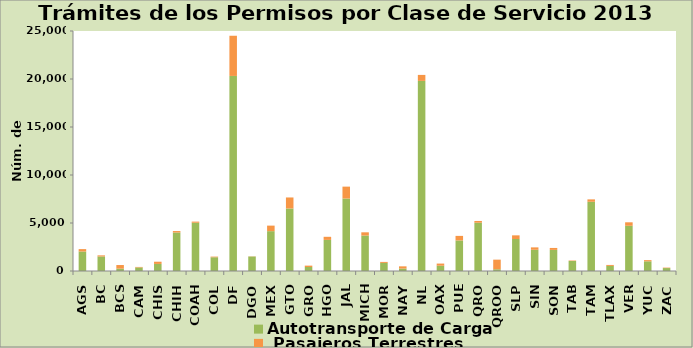
| Category | Autotransporte de Carga  |  Pasajeros Terrestres |
|---|---|---|
| AGS | 2028 | 252 |
| BC | 1512 | 116 |
| BCS | 246 | 376 |
| CAM | 369 | 55 |
| CHIS | 736 | 231 |
| CHIH | 4008 | 154 |
| COAH | 5026 | 119 |
| COL | 1431 | 67 |
| DF | 20319 | 4186 |
| DGO | 1510 | 18 |
| MEX | 4150 | 577 |
| GTO | 6511 | 1149 |
| GRO | 418 | 142 |
| HGO | 3237 | 325 |
| JAL | 7547 | 1242 |
| MICH | 3692 | 338 |
| MOR | 842 | 104 |
| NAY | 256 | 229 |
| NL | 19801 | 625 |
| OAX | 551 | 223 |
| PUE | 3183 | 474 |
| QRO | 5030 | 182 |
| QROO | 182 | 1000 |
| SLP | 3333 | 380 |
| SIN | 2210 | 250 |
| SON | 2198 | 203 |
| TAB | 1044 | 47 |
| TAM | 7211 | 249 |
| TLAX | 529 | 102 |
| VER | 4709 | 364 |
| YUC | 1008 | 124 |
| ZAC | 306 | 46 |